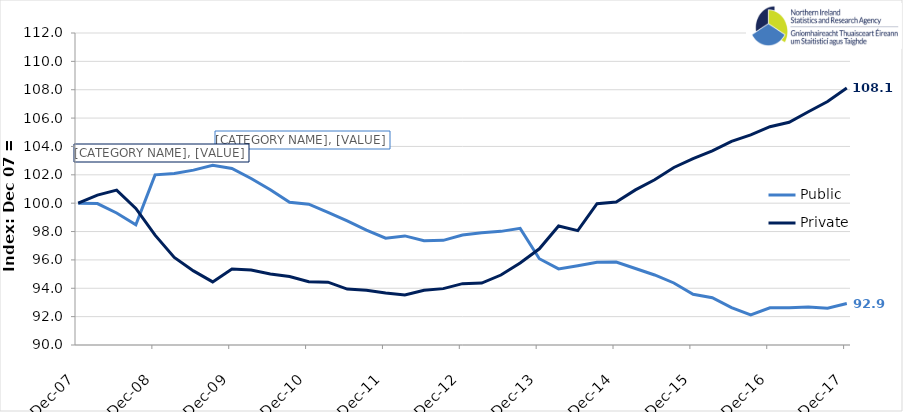
| Category | Public | Private |
|---|---|---|
| 2007-12-01 | 100 | 100 |
| 2008-03-01 | 99.971 | 100.571 |
| 2008-06-01 | 99.311 | 100.923 |
| 2008-09-01 | 98.481 | 99.628 |
| 2008-12-01 | 101.996 | 97.747 |
| 2009-03-01 | 102.086 | 96.174 |
| 2009-06-01 | 102.33 | 95.225 |
| 2009-09-01 | 102.68 | 94.45 |
| 2009-12-01 | 102.452 | 95.361 |
| 2010-03-01 | 101.74 | 95.287 |
| 2010-06-01 | 100.951 | 95.011 |
| 2010-09-01 | 100.058 | 94.83 |
| 2010-12-01 | 99.932 | 94.462 |
| 2011-03-01 | 99.353 | 94.428 |
| 2011-06-01 | 98.75 | 93.94 |
| 2011-09-01 | 98.106 | 93.86 |
| 2011-12-01 | 97.536 | 93.671 |
| 2012-03-01 | 97.692 | 93.524 |
| 2012-06-01 | 97.354 | 93.854 |
| 2012-09-01 | 97.378 | 93.975 |
| 2012-12-01 | 97.76 | 94.325 |
| 2013-03-01 | 97.911 | 94.366 |
| 2013-06-01 | 98.013 | 94.935 |
| 2013-09-01 | 98.227 | 95.785 |
| 2013-12-01 | 96.085 | 96.785 |
| 2014-03-01 | 95.363 | 98.394 |
| 2014-06-01 | 95.591 | 98.067 |
| 2014-09-01 | 95.829 | 99.966 |
| 2014-12-01 | 95.853 | 100.089 |
| 2015-03-01 | 95.397 | 100.939 |
| 2015-06-01 | 94.938 | 101.654 |
| 2015-09-01 | 94.373 | 102.515 |
| 2015-12-01 | 93.574 | 103.135 |
| 2016-03-01 | 93.338 | 103.687 |
| 2016-06-01 | 92.633 | 104.363 |
| 2016-09-01 | 92.127 | 104.812 |
| 2016-12-01 | 92.622 | 105.392 |
| 2017-03-01 | 92.632 | 105.704 |
| 2017-06-01 | 92.675 | 106.451 |
| 2017-09-01 | 92.587 | 107.167 |
| 2017-12-01 | 92.921 | 108.116 |